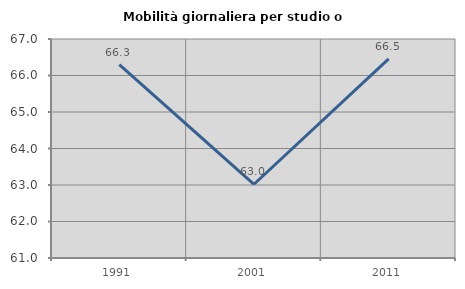
| Category | Mobilità giornaliera per studio o lavoro |
|---|---|
| 1991.0 | 66.299 |
| 2001.0 | 63.02 |
| 2011.0 | 66.456 |